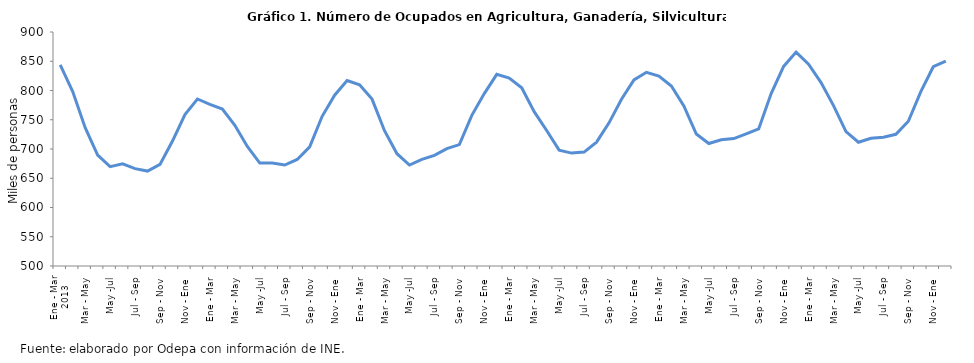
| Category | OCUPADOS AGRICULTURA |
|---|---|
| 0 | 843.658 |
| 1 | 798.266 |
| 2 | 736.461 |
| 3 | 689.358 |
| 4 | 669.839 |
| 5 | 674.791 |
| 6 | 666.406 |
| 7 | 662.262 |
| 8 | 673.724 |
| 9 | 713.604 |
| 10 | 758.988 |
| 11 | 785.537 |
| 12 | 776.373 |
| 13 | 768.303 |
| 14 | 740.609 |
| 15 | 704.367 |
| 16 | 675.938 |
| 17 | 676.058 |
| 18 | 672.6 |
| 19 | 682.074 |
| 20 | 703.599 |
| 21 | 755.905 |
| 22 | 791.902 |
| 23 | 817.027 |
| 24 | 809.646 |
| 25 | 785.301 |
| 26 | 731.282 |
| 27 | 691.978 |
| 28 | 672.526 |
| 29 | 682.164 |
| 30 | 689.034 |
| 31 | 700.719 |
| 32 | 707.439 |
| 33 | 757.522 |
| 34 | 794.669 |
| 35 | 827.605 |
| 36 | 821.367 |
| 37 | 804.582 |
| 38 | 763.826 |
| 39 | 731.558 |
| 40 | 698.04 |
| 41 | 692.989 |
| 42 | 694.776 |
| 43 | 711.757 |
| 44 | 744.739 |
| 45 | 785.03 |
| 46 | 818.051 |
| 47 | 831.11 |
| 48 | 824.789 |
| 49 | 807.606 |
| 50 | 773.662 |
| 51 | 725.597 |
| 52 | 709.369 |
| 53 | 715.675 |
| 54 | 717.856 |
| 55 | 725.965 |
| 56 | 734.277 |
| 57 | 794.66 |
| 58 | 841.147 |
| 59 | 865.659 |
| 60 | 845.074 |
| 61 | 813.586 |
| 62 | 774.131 |
| 63 | 729.695 |
| 64 | 711.581 |
| 65 | 718.419 |
| 66 | 720.091 |
| 67 | 725.105 |
| 68 | 747.425 |
| 69 | 798.027 |
| 70 | 840.667 |
| 71 | 850.292 |